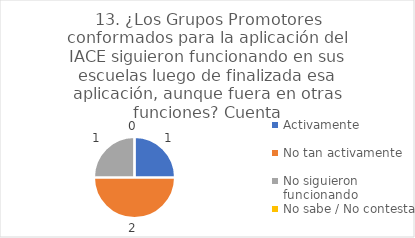
| Category | 13. ¿Los Grupos Promotores conformados para la aplicación del IACE siguieron funcionando en sus escuelas luego de finalizada esa aplicación, aunque fuera en otras funciones? |
|---|---|
| Activamente  | 0.25 |
| No tan activamente  | 0.5 |
| No siguieron funcionando  | 0.25 |
| No sabe / No contesta | 0 |